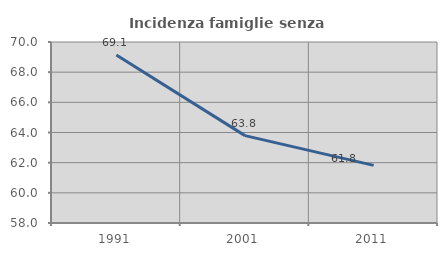
| Category | Incidenza famiglie senza nuclei |
|---|---|
| 1991.0 | 69.136 |
| 2001.0 | 63.793 |
| 2011.0 | 61.818 |